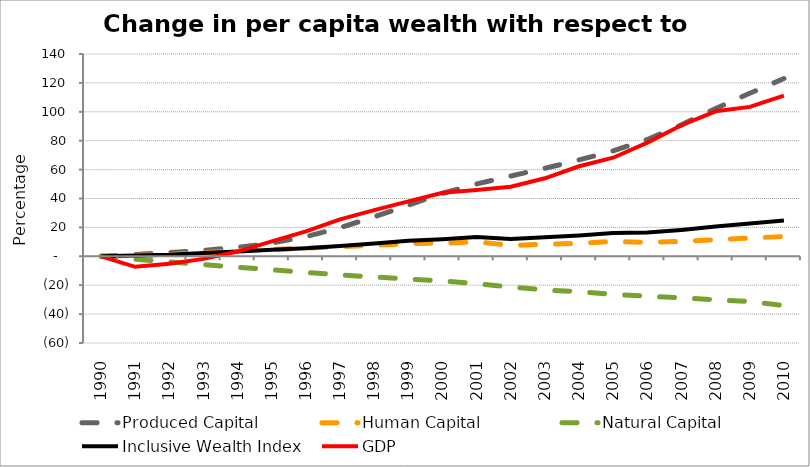
| Category | Produced Capital  | Human Capital | Natural Capital | Inclusive Wealth Index | GDP |
|---|---|---|---|---|---|
| 1990.0 | 0 | 0 | 0 | 0 | 0 |
| 1991.0 | 1.253 | 0.636 | -2.044 | 0.544 | -7.27 |
| 1992.0 | 2.617 | 1.206 | -3.906 | 1.062 | -5.154 |
| 1993.0 | 4.124 | 2.634 | -5.755 | 2.29 | -1.785 |
| 1994.0 | 6.143 | 3.732 | -7.538 | 3.323 | 3.283 |
| 1995.0 | 9.185 | 4.842 | -9.352 | 4.495 | 10.385 |
| 1996.0 | 13.605 | 5.616 | -11.192 | 5.574 | 17.25 |
| 1997.0 | 19.821 | 6.611 | -12.858 | 7.077 | 25.591 |
| 1998.0 | 27.34 | 7.674 | -14.323 | 8.814 | 31.926 |
| 1999.0 | 35.405 | 8.815 | -15.713 | 10.691 | 38.003 |
| 2000.0 | 43.535 | 9.037 | -17.054 | 11.839 | 44.008 |
| 2001.0 | 50.061 | 10.036 | -19.002 | 13.365 | 45.88 |
| 2002.0 | 55.587 | 7.496 | -21.207 | 11.894 | 48.126 |
| 2003.0 | 60.888 | 8.307 | -23.275 | 13.102 | 53.985 |
| 2004.0 | 66.676 | 9.058 | -24.494 | 14.38 | 62.313 |
| 2005.0 | 72.97 | 10.256 | -26.296 | 16.047 | 68.228 |
| 2006.0 | 80.863 | 9.635 | -27.639 | 16.484 | 78.68 |
| 2007.0 | 90.968 | 10.32 | -28.749 | 18.276 | 90.706 |
| 2008.0 | 102.277 | 11.474 | -30.096 | 20.586 | 100.333 |
| 2009.0 | 112.864 | 12.562 | -31.389 | 22.753 | 103.386 |
| 2010.0 | 122.993 | 13.739 | -34.126 | 24.84 | 111.256 |